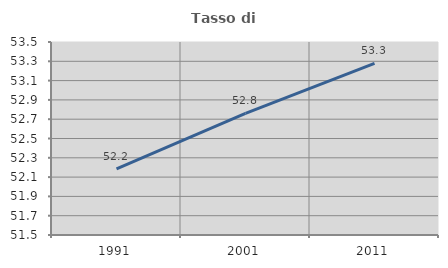
| Category | Tasso di occupazione   |
|---|---|
| 1991.0 | 52.185 |
| 2001.0 | 52.761 |
| 2011.0 | 53.278 |